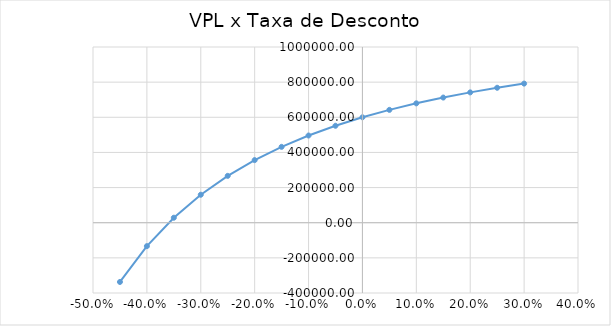
| Category | Series 0 |
|---|---|
| -0.45 | -337190.083 |
| -0.4 | -133333.333 |
| -0.35 | 28402.367 |
| -0.3 | 159183.673 |
| -0.25 | 266666.667 |
| -0.2 | 356250 |
| -0.15 | 431833.91 |
| -0.1 | 496296.296 |
| -0.05 | 551800.554 |
| 0.0 | 600000 |
| 0.05 | 642176.871 |
| 0.1 | 679338.843 |
| 0.15 | 712287.335 |
| 0.2 | 741666.667 |
| 0.25 | 768000 |
| 0.3 | 791715.976 |